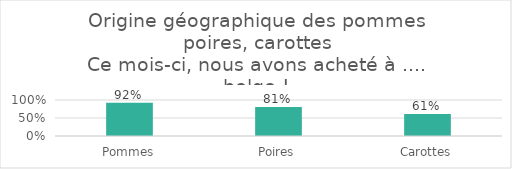
| Category | Series 0 |
|---|---|
| Pommes | 0.92 |
| Poires | 0.806 |
| Carottes | 0.614 |